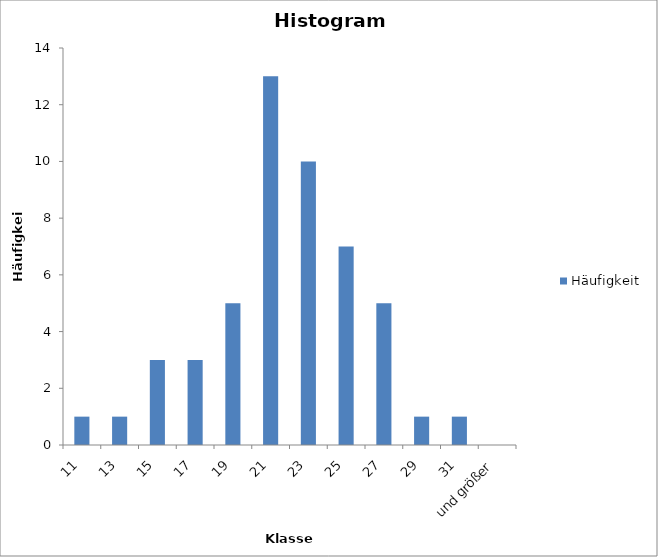
| Category | Häufigkeit |
|---|---|
| 11 | 1 |
| 13 | 1 |
| 15 | 3 |
| 17 | 3 |
| 19 | 5 |
| 21 | 13 |
| 23 | 10 |
| 25 | 7 |
| 27 | 5 |
| 29 | 1 |
| 31 | 1 |
| und größer | 0 |